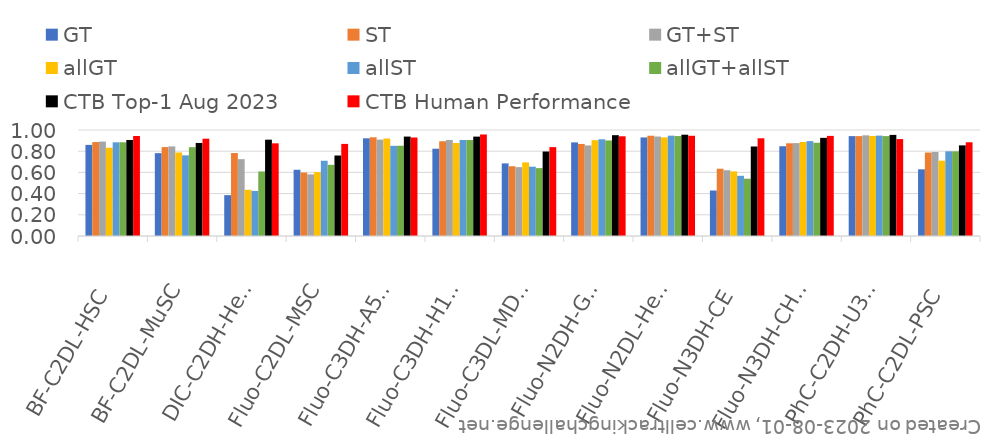
| Category | GT | ST | GT+ST | allGT | allST | allGT+allST | CTB Top-1 Aug 2023 | CTB Human Performance |
|---|---|---|---|---|---|---|---|---|
| BF-C2DL-HSC | 0.86 | 0.886 | 0.891 | 0.833 | 0.884 | 0.884 | 0.906 | 0.944 |
| BF-C2DL-MuSC | 0.782 | 0.839 | 0.845 | 0.788 | 0.761 | 0.838 | 0.878 | 0.918 |
| DIC-C2DH-HeLa | 0.385 | 0.783 | 0.725 | 0.436 | 0.425 | 0.609 | 0.909 | 0.874 |
| Fluo-C2DL-MSC | 0.625 | 0.599 | 0.581 | 0.602 | 0.71 | 0.671 | 0.759 | 0.869 |
| Fluo-C3DH-A549 | 0.922 | 0.931 | 0.909 | 0.92 | 0.851 | 0.852 | 0.938 | 0.929 |
| Fluo-C3DH-H157 | 0.823 | 0.894 | 0.906 | 0.877 | 0.906 | 0.905 | 0.938 | 0.958 |
| Fluo-C3DL-MDA231 | 0.685 | 0.658 | 0.65 | 0.694 | 0.654 | 0.64 | 0.797 | 0.838 |
| Fluo-N2DH-GOWT1 | 0.883 | 0.868 | 0.854 | 0.904 | 0.912 | 0.901 | 0.951 | 0.941 |
| Fluo-N2DL-HeLa | 0.93 | 0.946 | 0.938 | 0.93 | 0.947 | 0.943 | 0.956 | 0.946 |
| Fluo-N3DH-CE | 0.429 | 0.635 | 0.62 | 0.609 | 0.568 | 0.541 | 0.844 | 0.922 |
| Fluo-N3DH-CHO | 0.847 | 0.875 | 0.876 | 0.887 | 0.895 | 0.88 | 0.926 | 0.944 |
| PhC-C2DH-U373 | 0.942 | 0.942 | 0.95 | 0.944 | 0.947 | 0.942 | 0.954 | 0.914 |
| PhC-C2DL-PSC | 0.629 | 0.787 | 0.793 | 0.711 | 0.799 | 0.799 | 0.855 | 0.884 |